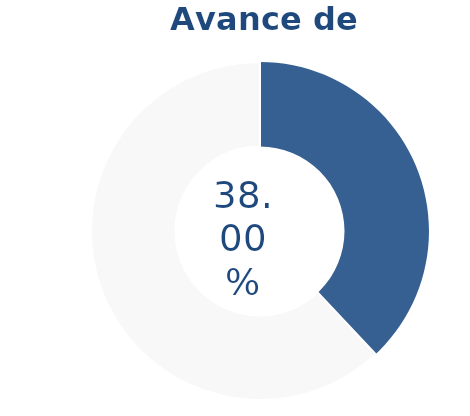
| Category | Series 0 |
|---|---|
| Acumulado 1 Trimestre | 0.38 |
| Año | -0.62 |